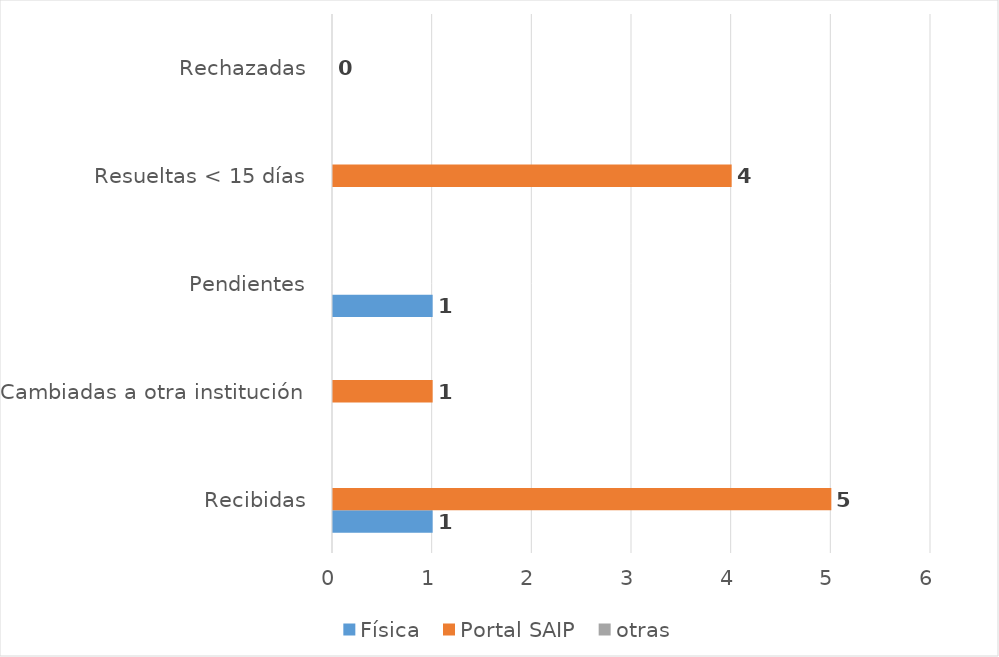
| Category | Física | Portal SAIP | otras |
|---|---|---|---|
| Recibidas | 1 | 5 | 0 |
| Cambiadas a otra institución | 0 | 1 | 0 |
| Pendientes | 1 | 0 | 0 |
| Resueltas < 15 días | 0 | 4 | 0 |
| Rechazadas | 0 | 0 | 0 |